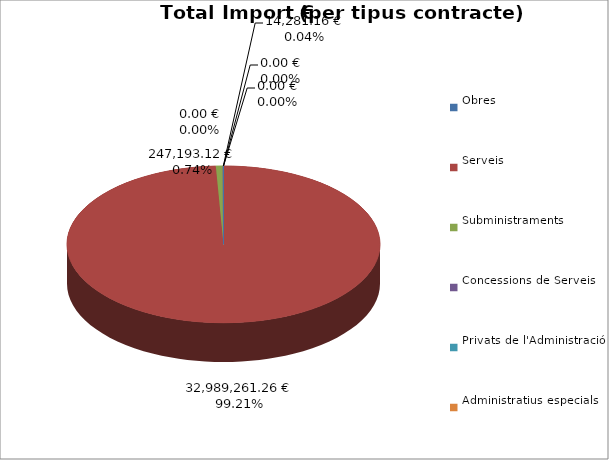
| Category | Total preu
(amb IVA) |
|---|---|
| Obres | 0 |
| Serveis | 32989261.26 |
| Subministraments | 247193.12 |
| Concessions de Serveis | 0 |
| Privats de l'Administració | 14281.16 |
| Administratius especials | 0 |